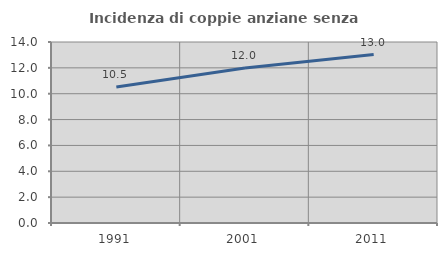
| Category | Incidenza di coppie anziane senza figli  |
|---|---|
| 1991.0 | 10.516 |
| 2001.0 | 11.985 |
| 2011.0 | 13.028 |